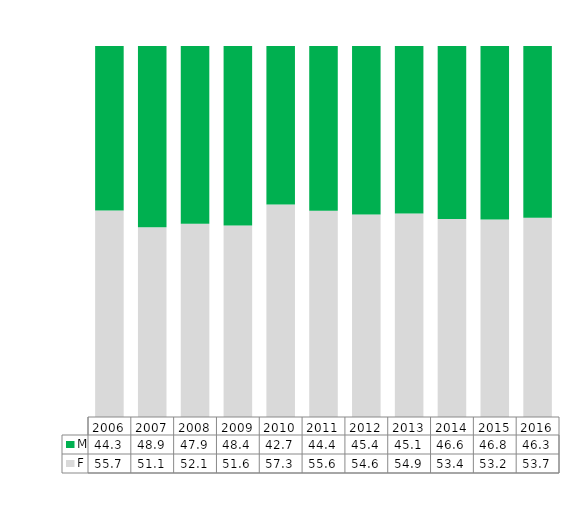
| Category | F | M |
|---|---|---|
| 2006.0 | 0.557 | 0.443 |
| 2007.0 | 0.511 | 0.489 |
| 2008.0 | 0.521 | 0.479 |
| 2009.0 | 0.516 | 0.484 |
| 2010.0 | 0.573 | 0.427 |
| 2011.0 | 0.556 | 0.444 |
| 2012.0 | 0.546 | 0.454 |
| 2013.0 | 0.549 | 0.451 |
| 2014.0 | 0.534 | 0.466 |
| 2015.0 | 0.532 | 0.468 |
| 2016.0 | 0.537 | 0.463 |